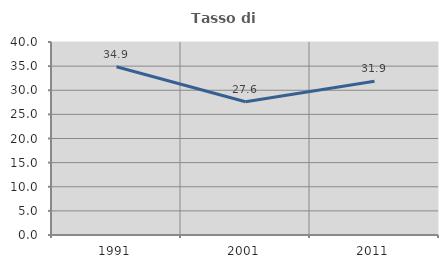
| Category | Tasso di occupazione   |
|---|---|
| 1991.0 | 34.857 |
| 2001.0 | 27.614 |
| 2011.0 | 31.873 |